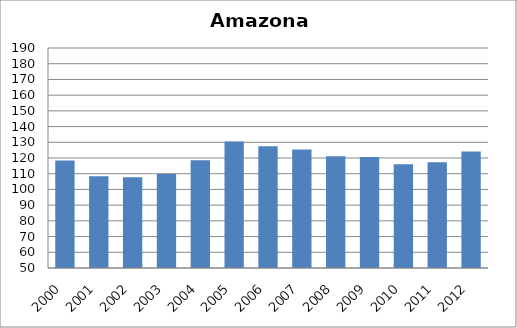
| Category | BCG |
|---|---|
| 2000.0 | 118.46 |
| 2001.0 | 108.31 |
| 2002.0 | 107.78 |
| 2003.0 | 109.89 |
| 2004.0 | 118.64 |
| 2005.0 | 130.49 |
| 2006.0 | 127.52 |
| 2007.0 | 125.35 |
| 2008.0 | 121.18 |
| 2009.0 | 120.62 |
| 2010.0 | 115.98 |
| 2011.0 | 117.27 |
| 2012.0 | 124.16 |